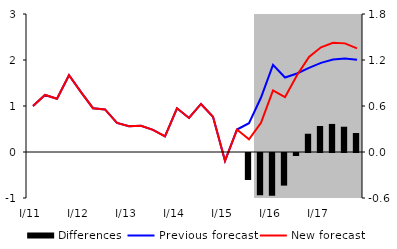
| Category | Differences |
|---|---|
| 0 | 0 |
| 1 | 0 |
| 2 | 0 |
| 3 | 0 |
| 4 | 0 |
| 5 | 0 |
| 6 | 0 |
| 7 | 0 |
| 8 | 0 |
| 9 | 0 |
| 10 | 0 |
| 11 | 0 |
| 12 | 0 |
| 13 | 0 |
| 14 | 0 |
| 15 | 0 |
| 16 | 0 |
| 17 | 0 |
| 18 | -0.352 |
| 19 | -0.551 |
| 20 | -0.558 |
| 21 | -0.425 |
| 22 | -0.039 |
| 23 | 0.238 |
| 24 | 0.339 |
| 25 | 0.366 |
| 26 | 0.33 |
| 27 | 0.248 |